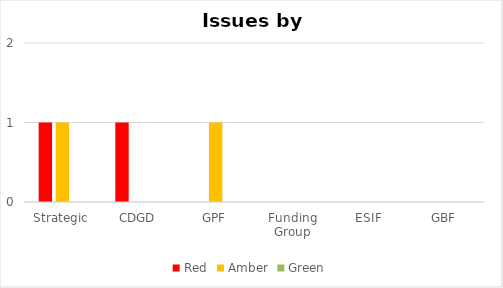
| Category | Red | Amber | Green |
|---|---|---|---|
| Strategic | 1 | 1 | 0 |
| CDGD | 1 | 0 | 0 |
| GPF | 0 | 1 | 0 |
| Funding Group | 0 | 0 | 0 |
| ESIF | 0 | 0 | 0 |
| GBF | 0 | 0 | 0 |